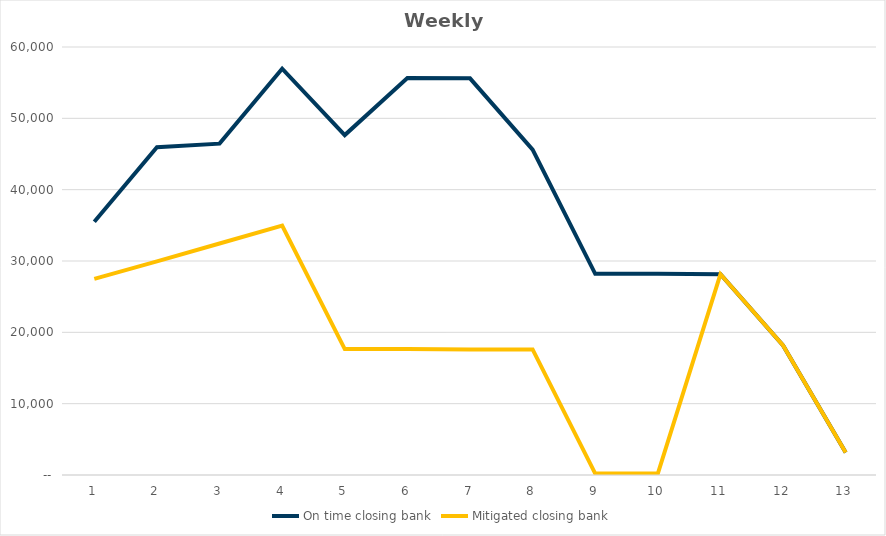
| Category | On time closing bank | Mitigated closing bank |
|---|---|---|
| 1.0 | 35500 | 27500 |
| 2.0 | 45953 | 29953 |
| 3.0 | 46453 | 32453 |
| 4.0 | 56953 | 34953 |
| 5.0 | 47653 | 17653 |
| 6.0 | 55653 | 17653 |
| 7.0 | 55606 | 17606 |
| 8.0 | 45606 | 17606 |
| 9.0 | 28206 | 206 |
| 10.0 | 28206 | 206 |
| 11.0 | 28159 | 28159 |
| 12.0 | 18159 | 18159 |
| 13.0 | 3159 | 3159 |